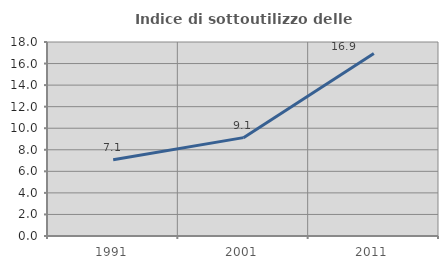
| Category | Indice di sottoutilizzo delle abitazioni  |
|---|---|
| 1991.0 | 7.083 |
| 2001.0 | 9.126 |
| 2011.0 | 16.924 |